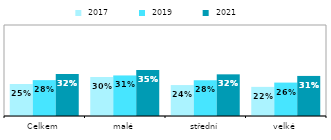
| Category |  2017 |  2019 |  2021 |
|---|---|---|---|
| Celkem | 0.246 | 0.276 | 0.324 |
| malé | 0.3 | 0.312 | 0.355 |
| střední | 0.238 | 0.275 | 0.32 |
| velké | 0.224 | 0.257 | 0.308 |